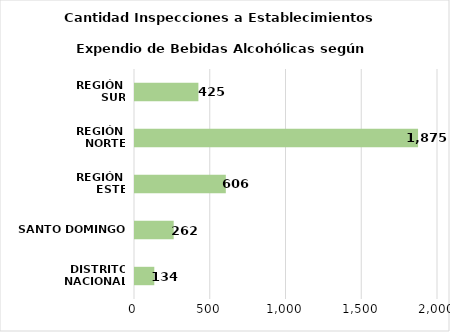
| Category | Series 0 |
|---|---|
| DISTRITO NACIONAL | 134 |
| SANTO DOMINGO | 262 |
| REGIÓN 
ESTE | 606 |
| REGIÓN 
NORTE | 1875 |
| REGIÓN 
SUR | 425 |